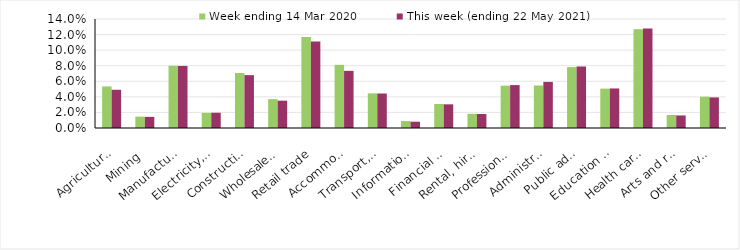
| Category | Week ending 14 Mar 2020 | This week (ending 22 May 2021) |
|---|---|---|
| Agriculture, forestry and fishing | 0.053 | 0.049 |
| Mining | 0.015 | 0.014 |
| Manufacturing | 0.08 | 0.08 |
| Electricity, gas, water and waste services | 0.019 | 0.02 |
| Construction | 0.071 | 0.068 |
| Wholesale trade | 0.037 | 0.035 |
| Retail trade | 0.117 | 0.111 |
| Accommodation and food services | 0.081 | 0.073 |
| Transport, postal and warehousing | 0.044 | 0.044 |
| Information media and telecommunications | 0.009 | 0.008 |
| Financial and insurance services | 0.031 | 0.03 |
| Rental, hiring and real estate services | 0.018 | 0.018 |
| Professional, scientific and technical services | 0.054 | 0.055 |
| Administrative and support services | 0.055 | 0.059 |
| Public administration and safety | 0.078 | 0.079 |
| Education and training | 0.051 | 0.051 |
| Health care and social assistance | 0.127 | 0.128 |
| Arts and recreation services | 0.017 | 0.016 |
| Other services | 0.04 | 0.039 |